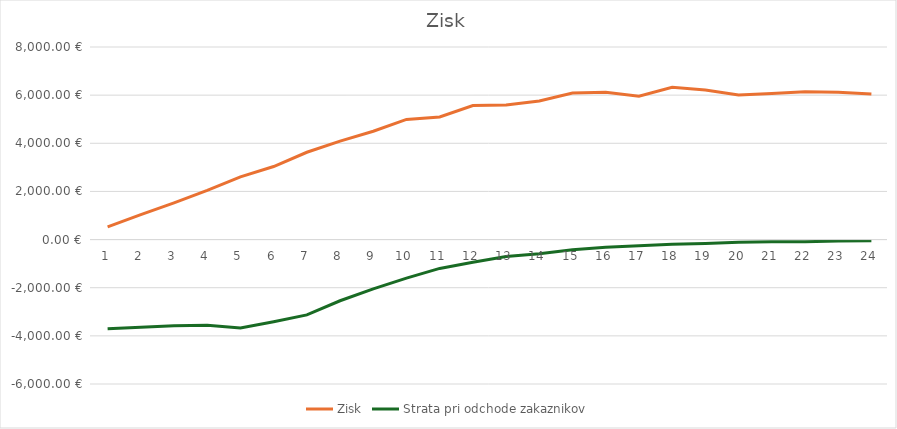
| Category | Zisk | Strata pri odchode zakaznikov |
|---|---|---|
| 0 | 529.48 | -3704.62 |
| 1 | 1032.88 | -3638.58 |
| 2 | 1523.8 | -3576.94 |
| 3 | 2046.2 | -3560.2 |
| 4 | 2607.14 | -3671.76 |
| 5 | 3034.66 | -3414.2 |
| 6 | 3626.6 | -3128.76 |
| 7 | 4091.12 | -2542.06 |
| 8 | 4500.06 | -2048.2 |
| 9 | 4991.38 | -1603.498 |
| 10 | 5092.6 | -1197.96 |
| 11 | 5566.94 | -938.8 |
| 12 | 5595.58 | -707.14 |
| 13 | 5759.8 | -589.64 |
| 14 | 6084.9 | -422.18 |
| 15 | 6115.12 | -316.94 |
| 16 | 5955.28 | -255.88 |
| 17 | 6326.9 | -194.68 |
| 18 | 6209.34 | -162.7 |
| 19 | 6002.84 | -108.32 |
| 20 | 6072.28 | -92.62 |
| 21 | 6144.7 | -93.94 |
| 22 | 6121.58 | -57.68 |
| 23 | 6043.2 | -52.54 |